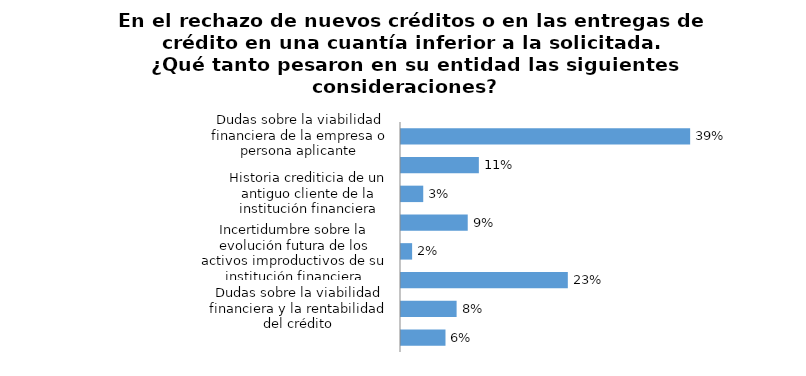
| Category | Series 0 |
|---|---|
| Dudas sobre la viabilidad financiera de la empresa o persona aplicante | 0.394 |
| Falta de información financiera de los nuevos aplicantes a crédito | 0.106 |
| Historia crediticia de un antiguo cliente de la institución financiera | 0.03 |
| Historia crediticia del cliente en otra institución financiera | 0.091 |
| Incertidumbre sobre la evolución futura de los activos improductivos de su institución financiera | 0.015 |
| Por sector productivo al cual pertenece el aplicante de crédito o del cual deriva sus principales fuentes de ingreso | 0.227 |
| Dudas sobre la viabilidad financiera y la rentabilidad del crédito | 0.076 |
| Otra | 0.061 |